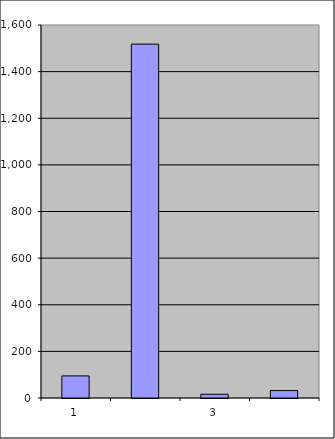
| Category | Series 0 |
|---|---|
| 0 | 94.75 |
| 1 | 1517.947 |
| 2 | 16.086 |
| 3 | 31.728 |